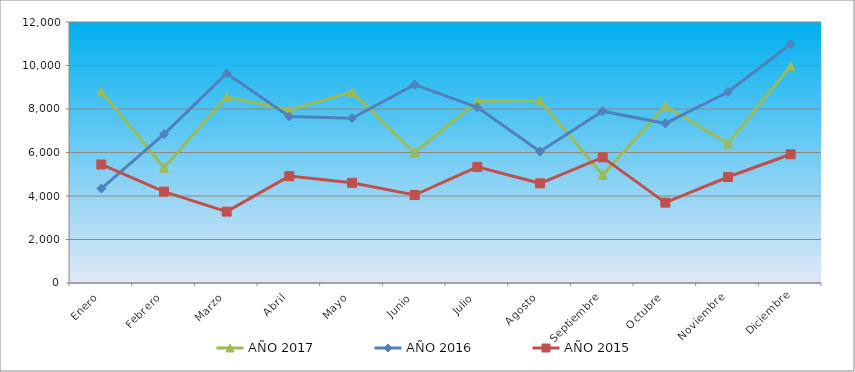
| Category | AÑO 2017 | AÑO 2016 | AÑO 2015 |
|---|---|---|---|
| Enero | 8806 | 4343 | 5449 |
| Febrero | 5298 | 6843 | 4204 |
| Marzo | 8560 | 9633 | 3283 |
| Abril | 7956 | 7654 | 4914 |
| Mayo | 8785 | 7576 | 4605 |
| Junio | 5989 | 9123 | 4044 |
| Julio | 8354 | 8076 | 5338 |
| Agosto | 8394 | 6043 | 4583 |
| Septiembre | 4970 | 7900 | 5775 |
| Octubre | 8138 | 7337 | 3695 |
| Noviembre | 6409 | 8781 | 4873 |
| Diciembre | 9983 | 10987 | 5918 |